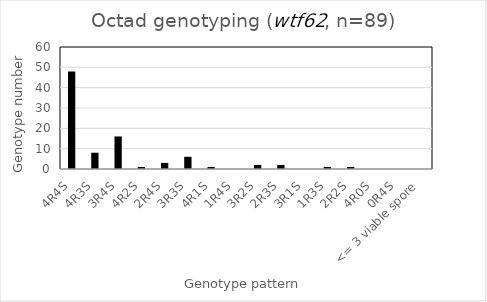
| Category | Number |
|---|---|
| 4R4S | 48 |
| 4R3S | 8 |
| 3R4S | 16 |
| 4R2S | 1 |
| 2R4S | 3 |
| 3R3S | 6 |
| 4R1S | 1 |
| 1R4S | 0 |
| 3R2S | 2 |
| 2R3S | 2 |
| 3R1S | 0 |
| 1R3S | 1 |
| 2R2S | 1 |
| 4R0S | 0 |
| 0R4S | 0 |
| <= 3 viable spore | 0 |